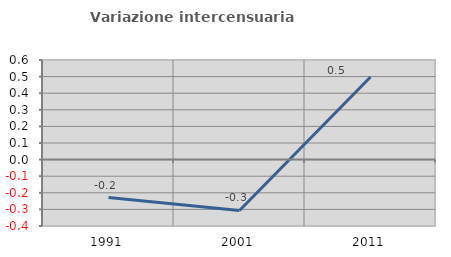
| Category | Variazione intercensuaria annua |
|---|---|
| 1991.0 | -0.229 |
| 2001.0 | -0.306 |
| 2011.0 | 0.498 |